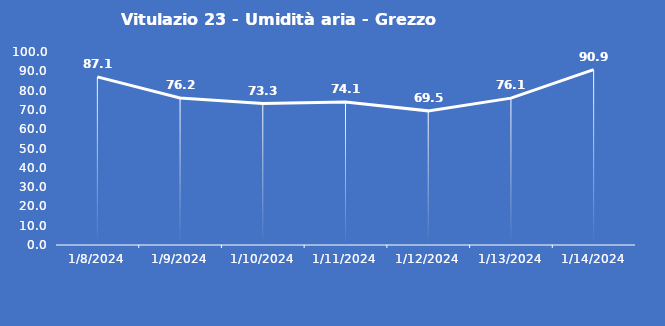
| Category | Vitulazio 23 - Umidità aria - Grezzo (%) |
|---|---|
| 1/8/24 | 87.1 |
| 1/9/24 | 76.2 |
| 1/10/24 | 73.3 |
| 1/11/24 | 74.1 |
| 1/12/24 | 69.5 |
| 1/13/24 | 76.1 |
| 1/14/24 | 90.9 |